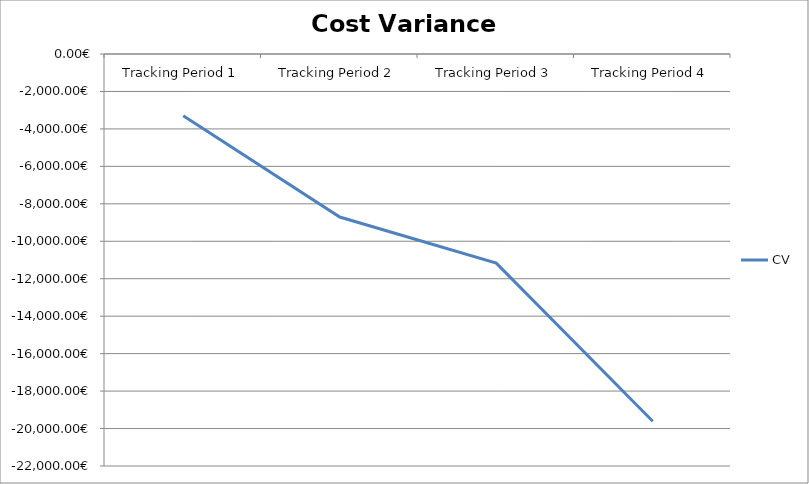
| Category | CV |
|---|---|
| Tracking Period 1 | -3297 |
| Tracking Period 2 | -8704 |
| Tracking Period 3 | -11167 |
| Tracking Period 4 | -19610 |